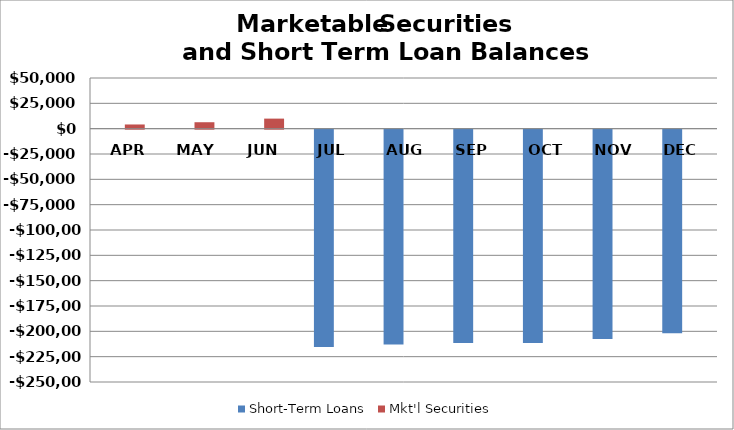
| Category | Short-Term Loans | Mkt'l Securities |
|---|---|---|
| APR | 0 | 4140 |
| MAY | 0 | 6355 |
| JUN | 0 | 9921.5 |
| JUL | -214373.5 | 0 |
| AUG | -212055.5 | 0 |
| SEP | -210586 | 0 |
| OCT | -210515.5 | 0 |
| NOV | -206675 | 0 |
| DEC | -201008 | 0 |